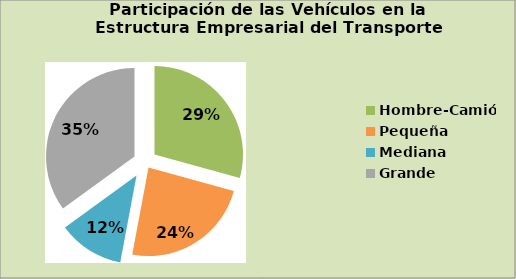
| Category | Series 0 |
|---|---|
| Hombre-Camión | 29.265 |
| Pequeña | 23.678 |
| Mediana | 12.048 |
| Grande | 35.01 |